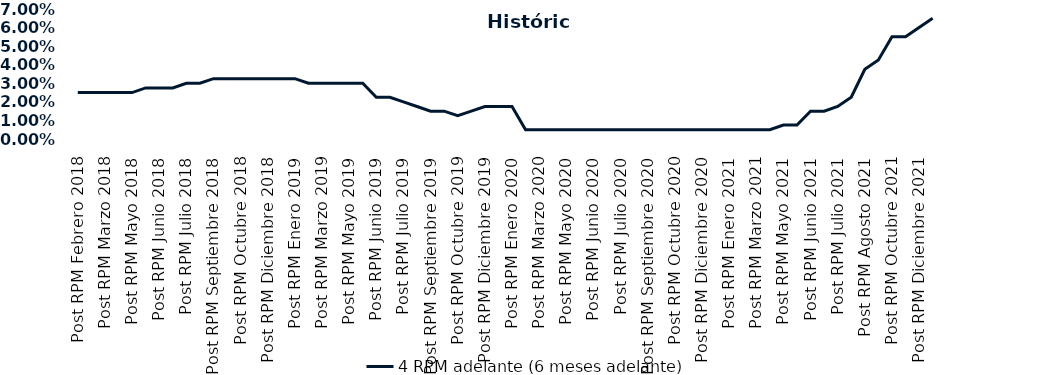
| Category | 4 RPM adelante (6 meses adelante) |
|---|---|
| Post RPM Febrero 2018 | 0.025 |
| Pre RPM Marzo 2018 | 0.025 |
| Post RPM Marzo 2018 | 0.025 |
| Pre RPM Mayo 2018 | 0.025 |
| Post RPM Mayo 2018 | 0.025 |
| Pre RPM Junio 2018 | 0.028 |
| Post RPM Junio 2018 | 0.028 |
| Pre RPM Julio 2018 | 0.028 |
| Post RPM Julio 2018 | 0.03 |
| Pre RPM Septiembre 2018 | 0.03 |
| Post RPM Septiembre 2018 | 0.032 |
| Pre RPM Octubre 2018 | 0.032 |
| Post RPM Octubre 2018 | 0.032 |
| Pre RPM Diciembre 2018 | 0.032 |
| Post RPM Diciembre 2018 | 0.032 |
| Pre RPM Enero 2019 | 0.032 |
| Post RPM Enero 2019 | 0.032 |
| Pre RPM Marzo 2019 | 0.03 |
| Post RPM Marzo 2019 | 0.03 |
| Pre RPM Mayo 2019 | 0.03 |
| Post RPM Mayo 2019 | 0.03 |
| Pre RPM Junio 2019 | 0.03 |
| Post RPM Junio 2019 | 0.022 |
| Pre RPM Julio 2019 | 0.022 |
| Post RPM Julio 2019 | 0.02 |
| Pre RPM Septiembre 2019 | 0.018 |
| Post RPM Septiembre 2019 | 0.015 |
| Pre RPM Octubre 2019 | 0.015 |
| Post RPM Octubre 2019 | 0.012 |
| Pre RPM Diciembre 2019 | 0.015 |
| Post RPM Diciembre 2019 | 0.018 |
| Pre RPM Enero 2020 | 0.018 |
| Post RPM Enero 2020 | 0.018 |
| Pre RPM Marzo 2020 | 0.005 |
| Post RPM Marzo 2020 | 0.005 |
| Pre RPM Mayo 2020 | 0.005 |
| Post RPM Mayo 2020 | 0.005 |
| Pre RPM Junio 2020 | 0.005 |
| Post RPM Junio 2020 | 0.005 |
| Pre RPM Julio 2020 | 0.005 |
| Post RPM Julio 2020 | 0.005 |
| Pre RPM Septiembre 2020 | 0.005 |
| Post RPM Septiembre 2020 | 0.005 |
| Pre RPM Octubre 2020 | 0.005 |
| Post RPM Octubre 2020 | 0.005 |
| Pre RPM Diciembre 2020 | 0.005 |
| Post RPM Diciembre 2020 | 0.005 |
| Pre RPM Enero 2021 | 0.005 |
| Post RPM Enero 2021 | 0.005 |
| Pre RPM Marzo 2021 | 0.005 |
| Post RPM Marzo 2021 | 0.005 |
| Pre RPM Mayo 2021 | 0.005 |
| Post RPM Mayo 2021 | 0.008 |
| Pre RPM Junio 2021 | 0.008 |
| Post RPM Junio 2021 | 0.015 |
| Pre RPM Julio 2021 | 0.015 |
| Post RPM Julio 2021 | 0.018 |
| Pre RPM Agosto 2021 | 0.022 |
| Post RPM Agosto 2021 | 0.038 |
| Pre RPM Octubre 2021 | 0.042 |
| Post RPM Octubre 2021 | 0.055 |
| Pre RPM Diciembre 2021 | 0.055 |
| Post RPM Diciembre 2021 | 0.06 |
| Pre RPM Enero 2022 | 0.065 |